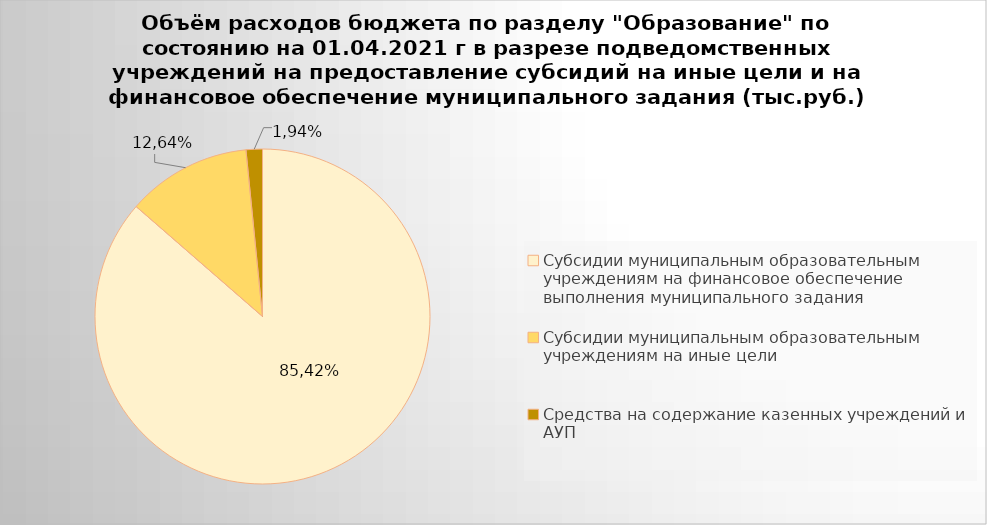
| Category | Series 0 |
|---|---|
| Субсидии муниципальным образовательным учреждениям на финансовое обеспечение выполнения муниципального задания | 5111892.5 |
| Субсидии муниципальным образовательным учреждениям на иные цели | 711650.3 |
| Средства на содержание казенных учреждений и АУП | 93284.25 |